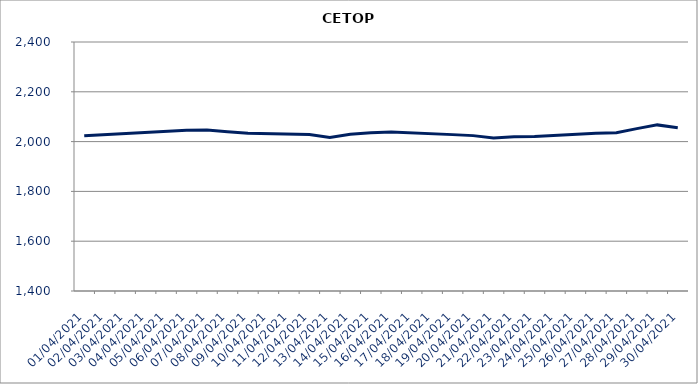
| Category | CETOP |
|---|---|
| 01/04/2021 | 2023.58 |
| 06/04/2021 | 2045.4 |
| 07/04/2021 | 2046.41 |
| 08/04/2021 | 2039.84 |
| 09/04/2021 | 2033.25 |
| 12/04/2021 | 2028.9 |
| 13/04/2021 | 2016.66 |
| 14/04/2021 | 2029.14 |
| 15/04/2021 | 2035.89 |
| 16/04/2021 | 2038.42 |
| 19/04/2021 | 2028.01 |
| 20/04/2021 | 2024 |
| 21/04/2021 | 2014.62 |
| 22/04/2021 | 2019.58 |
| 23/04/2021 | 2020.23 |
| 26/04/2021 | 2033.61 |
| 27/04/2021 | 2035.8 |
| 28/04/2021 | 2052.04 |
| 29/04/2021 | 2067.11 |
| 30/04/2021 | 2055.6 |